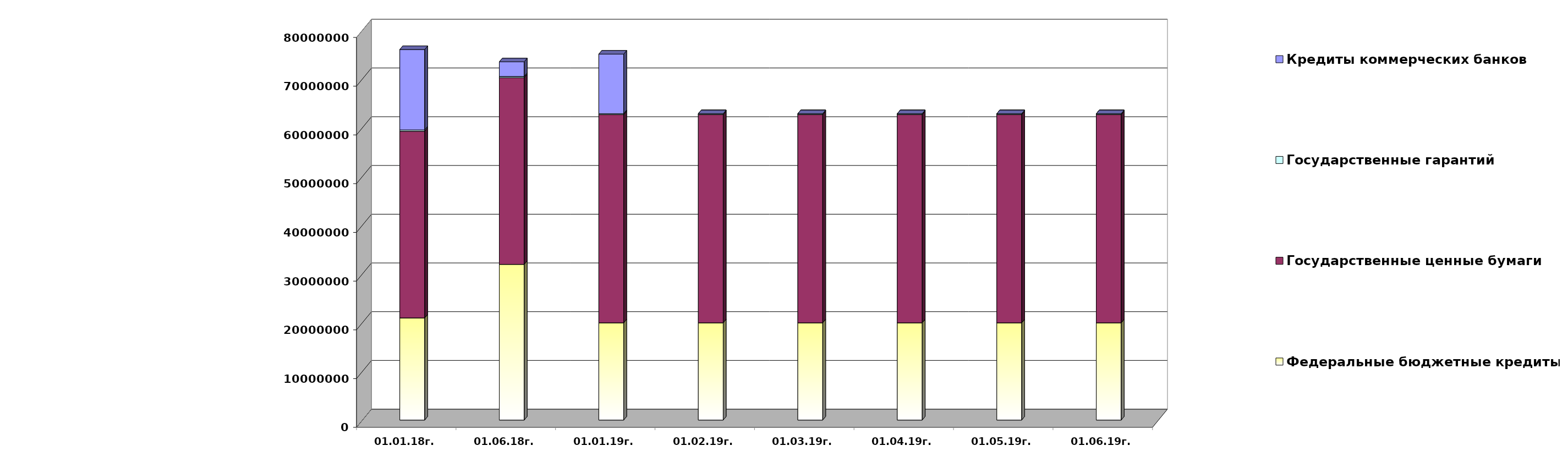
| Category | Федеральные бюджетные кредиты | Государственные ценные бумаги  | Государственные гарантий | Кредиты коммерческих банков |
|---|---|---|---|---|
| 01.01.18г. | 20959084.963 | 38300000 | 267412.82 | 16500000 |
| 01.06.18г. | 31945227.963 | 38300000 | 253223.16 | 3000000 |
| 01.01.19г. | 19957026.213 | 42700000 | 209872.86 | 12219963.75 |
| 01.02.19г. | 19957026.213 | 42700000 | 200735.86 | 0 |
| 01.03.19г. | 19957026.213 | 42700000 | 200735.86 | 0 |
| 01.04.19г. | 19957026.213 | 42700000 | 200735.86 | 0 |
| 01.05.19г. | 19957026.213 | 42700000 | 200735.86 | 0 |
| 01.06.19г. | 19957026.213 | 42700000 | 200735.86 | 0 |